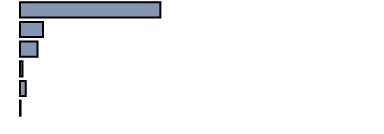
| Category | 46,9 |
|---|---|
| 0 | 39.314 |
| 1 | 6.411 |
| 2 | 4.931 |
| 3 | 0.708 |
| 4 | 1.579 |
| 5 | 0.152 |